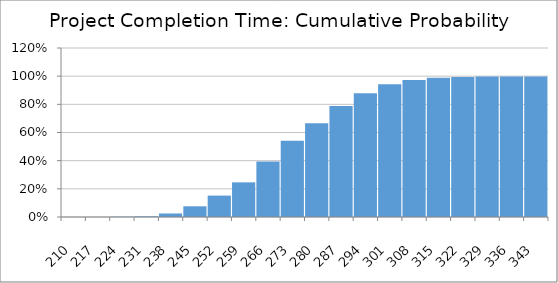
| Category | Series 0 |
|---|---|
| 210.0 | 0 |
| 217.0 | 0 |
| 224.0 | 0.002 |
| 231.0 | 0.005 |
| 238.0 | 0.025 |
| 245.0 | 0.076 |
| 252.0 | 0.152 |
| 259.0 | 0.246 |
| 266.0 | 0.394 |
| 273.0 | 0.541 |
| 280.0 | 0.665 |
| 287.0 | 0.788 |
| 294.0 | 0.878 |
| 301.0 | 0.943 |
| 308.0 | 0.972 |
| 315.0 | 0.989 |
| 322.0 | 0.994 |
| 329.0 | 0.998 |
| 336.0 | 0.998 |
| 343.0 | 0.998 |